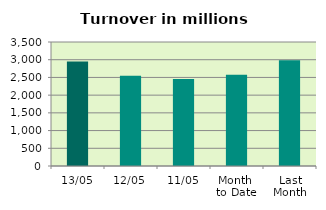
| Category | Series 0 |
|---|---|
| 13/05 | 2946.469 |
| 12/05 | 2546.794 |
| 11/05 | 2455.495 |
| Month 
to Date | 2578.14 |
| Last
Month | 2985.476 |